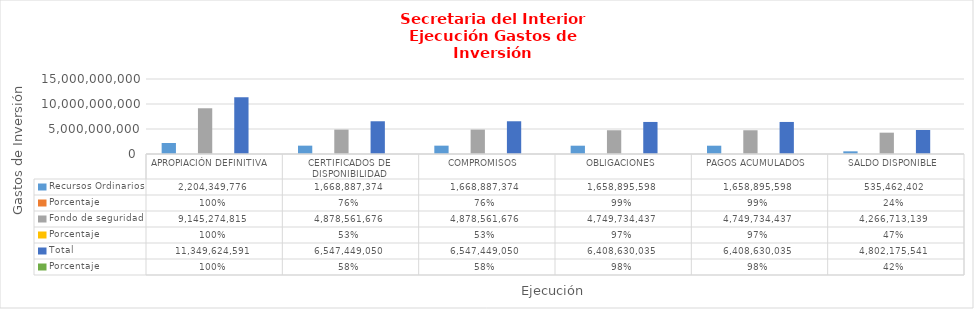
| Category | Recursos Ordinarios | Porcentaje | Fondo de seguridad  | Total |
|---|---|---|---|---|
| APROPIACIÓN DEFINITIVA  | 2204349776 | 1 | 9145274815.1 | 11349624591.1 |
| CERTIFICADOS DE DISPONIBILIDAD | 1668887374 | 0.577 | 4878561676 | 6547449050 |
| COMPROMISOS  | 1668887374 | 0.577 | 4878561676 | 6547449050 |
| OBLIGACIONES | 1658895598 | 0.979 | 4749734437 | 6408630035 |
| PAGOS ACUMULADOS | 1658895598 | 0.979 | 4749734437 | 6408630035 |
| SALDO DISPONIBLE | 535462402 | 0.423 | 4266713139.1 | 4802175541.1 |